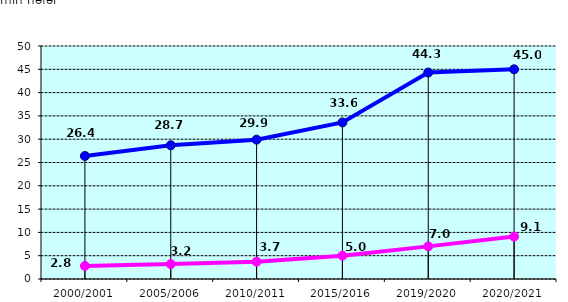
| Category | bakalavriat   bachelor   в бакалавриат   | magistratura   magistry   в магистратуру |
|---|---|---|
| 2000/2001 | 26.4 | 2.8 |
| 2005/2006 | 28.7 | 3.2 |
| 2010/2011 | 29.9 | 3.7 |
| 2015/2016 | 33.6 | 5 |
| 2019/2020 | 44.3 | 7 |
| 2020/2021 | 45 | 9.1 |